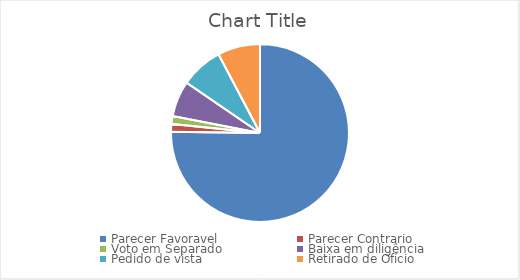
| Category | Series 0 | Series 1 |
|---|---|---|
| Parecer Favoravel | 370 |  |
| Parecer Contrario | 7 |  |
| Voto em Separado  | 7 |  |
| Baixa em diligência | 32 |  |
| Pedido de vista | 38 |  |
| Retirado de Ofício | 38 |  |